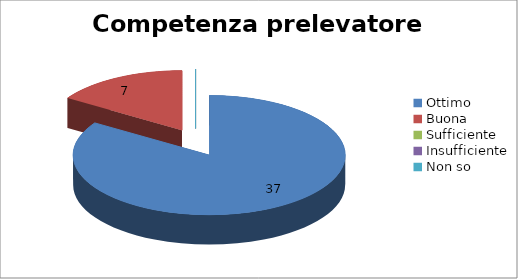
| Category | Competenza prelevatore |
|---|---|
| Ottimo | 37 |
| Buona | 7 |
| Sufficiente | 0 |
| Insufficiente | 0 |
| Non so | 0 |